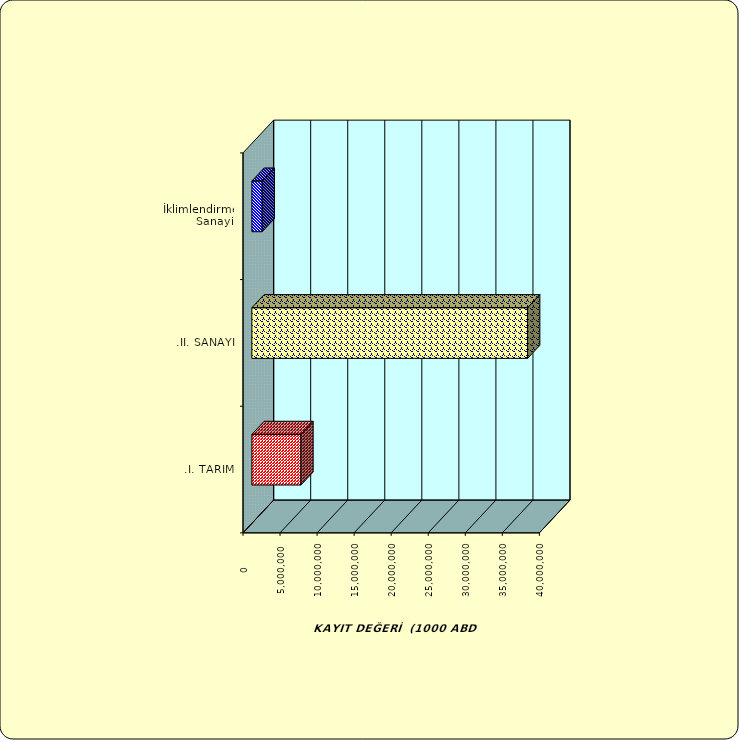
| Category | Series 0 |
|---|---|
| .I. TARIM | 6621083.643 |
| .II. SANAYİ | 37218155 |
|  İklimlendirme Sanayii | 1393256.457 |